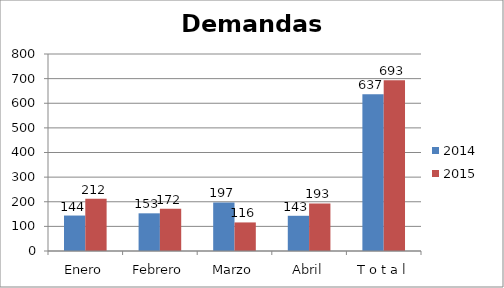
| Category | 2014 | 2015 |
|---|---|---|
| Enero | 144 | 212 |
| Febrero | 153 | 172 |
| Marzo | 197 | 116 |
| Abril | 143 | 193 |
| T o t a l | 637 | 693 |